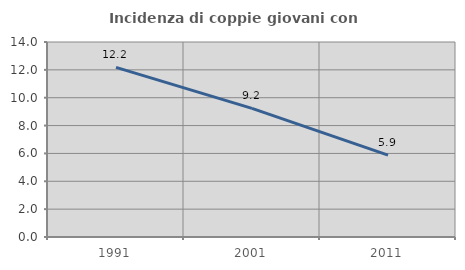
| Category | Incidenza di coppie giovani con figli |
|---|---|
| 1991.0 | 12.179 |
| 2001.0 | 9.236 |
| 2011.0 | 5.882 |